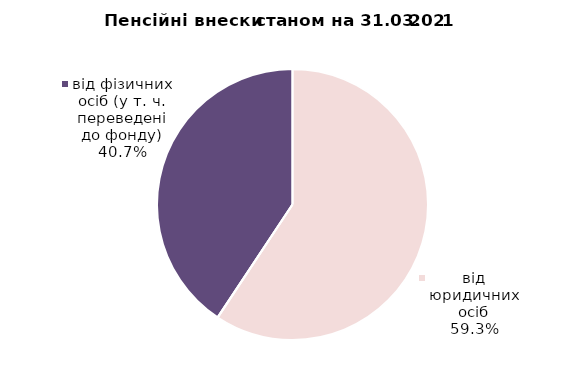
| Category | Series 0 |
|---|---|
| від юридичних осіб | 851.175 |
| від ФОПів | 0.27 |
| від фізичних осіб (у т. ч. переведені до фонду) | 583.869 |